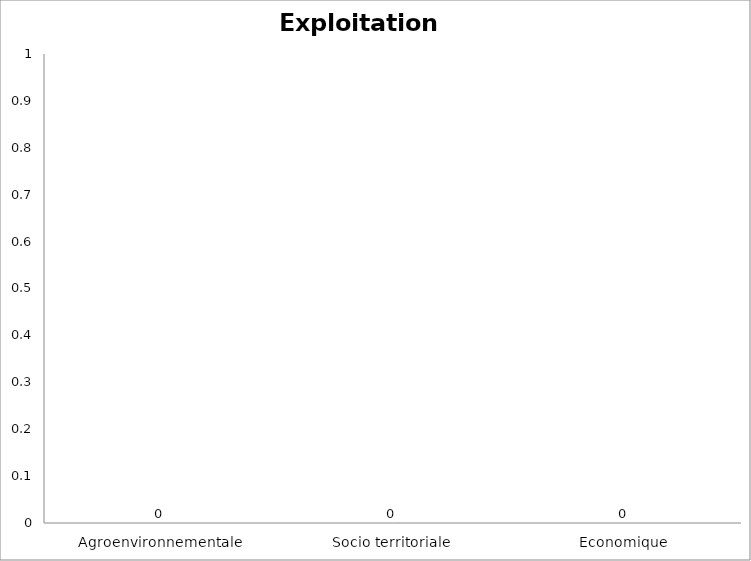
| Category | Campagne agricole 
…………. |
|---|---|
| Agroenvironnementale | 0 |
| Socio territoriale | 0 |
| Economique | 0 |